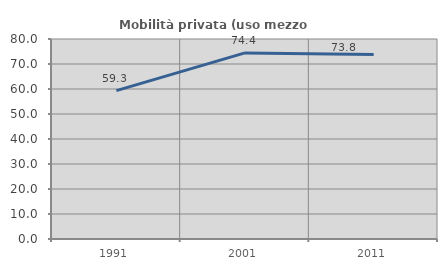
| Category | Mobilità privata (uso mezzo privato) |
|---|---|
| 1991.0 | 59.335 |
| 2001.0 | 74.45 |
| 2011.0 | 73.796 |